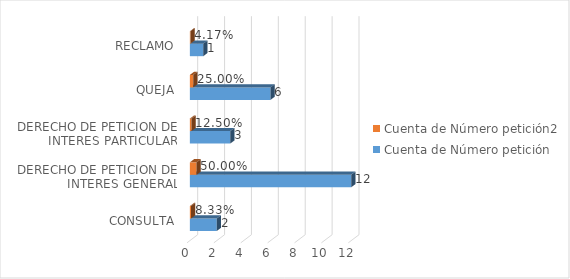
| Category | Cuenta de Número petición | Cuenta de Número petición2 |
|---|---|---|
| CONSULTA | 2 | 0.083 |
| DERECHO DE PETICION DE INTERES GENERAL | 12 | 0.5 |
| DERECHO DE PETICION DE INTERES PARTICULAR | 3 | 0.125 |
| QUEJA | 6 | 0.25 |
| RECLAMO | 1 | 0.042 |